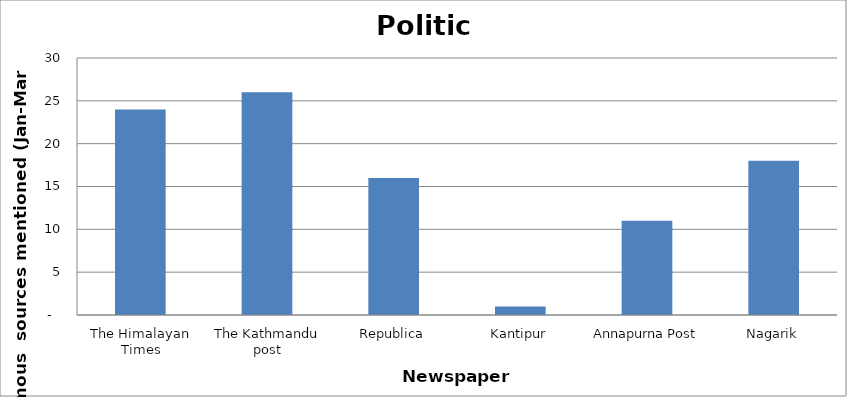
| Category | Politics |
|---|---|
| The Himalayan Times | 24 |
| The Kathmandu post | 26 |
| Republica | 16 |
| Kantipur | 1 |
| Annapurna Post | 11 |
| Nagarik | 18 |